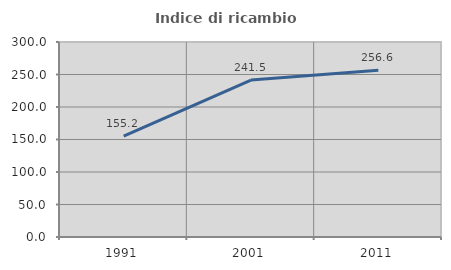
| Category | Indice di ricambio occupazionale  |
|---|---|
| 1991.0 | 155.198 |
| 2001.0 | 241.492 |
| 2011.0 | 256.607 |